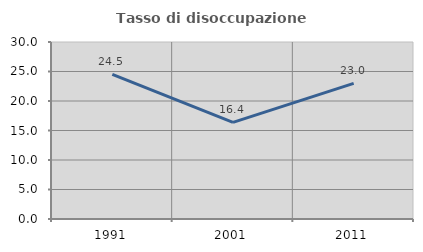
| Category | Tasso di disoccupazione giovanile  |
|---|---|
| 1991.0 | 24.5 |
| 2001.0 | 16.379 |
| 2011.0 | 22.989 |